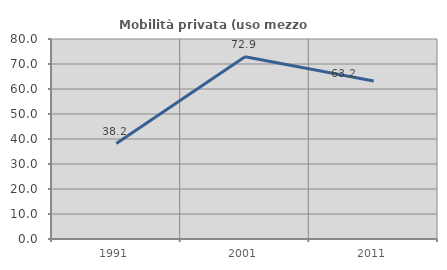
| Category | Mobilità privata (uso mezzo privato) |
|---|---|
| 1991.0 | 38.182 |
| 2001.0 | 72.881 |
| 2011.0 | 63.218 |